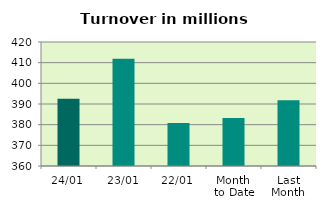
| Category | Series 0 |
|---|---|
| 24/01 | 392.493 |
| 23/01 | 411.912 |
| 22/01 | 380.765 |
| Month 
to Date | 383.185 |
| Last
Month | 391.769 |